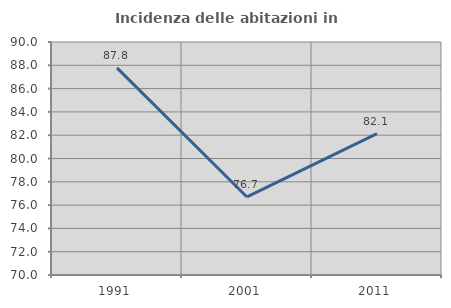
| Category | Incidenza delle abitazioni in proprietà  |
|---|---|
| 1991.0 | 87.778 |
| 2001.0 | 76.699 |
| 2011.0 | 82.143 |